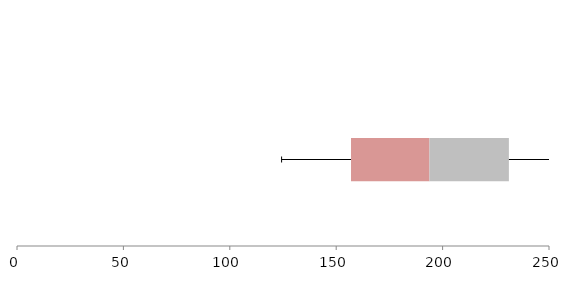
| Category | Series 1 | Series 2 | Series 3 |
|---|---|---|---|
| 0 | 156.962 | 36.857 | 37.334 |